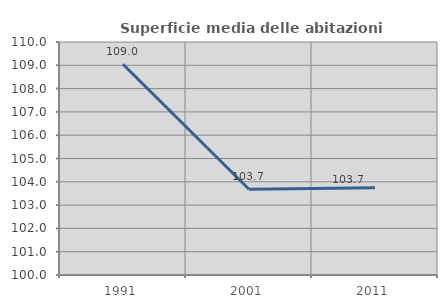
| Category | Superficie media delle abitazioni occupate |
|---|---|
| 1991.0 | 109.044 |
| 2001.0 | 103.68 |
| 2011.0 | 103.742 |